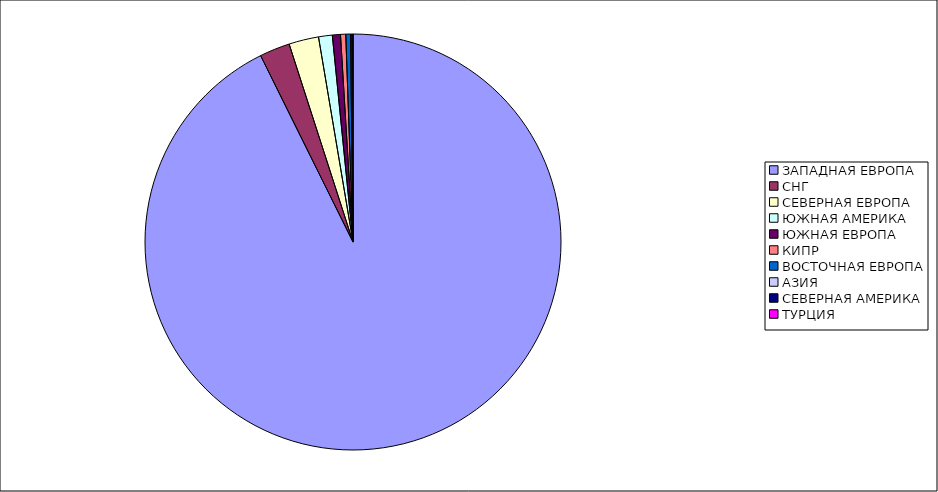
| Category | Оборот |
|---|---|
| ЗАПАДНАЯ ЕВРОПА | 0.927 |
| СНГ | 0.024 |
| СЕВЕРНАЯ ЕВРОПА | 0.023 |
| ЮЖНАЯ АМЕРИКА | 0.011 |
| ЮЖНАЯ ЕВРОПА | 0.006 |
| КИПР | 0.004 |
| ВОСТОЧНАЯ ЕВРОПА | 0.004 |
| АЗИЯ | 0.001 |
| СЕВЕРНАЯ АМЕРИКА | 0.001 |
| ТУРЦИЯ | 0 |